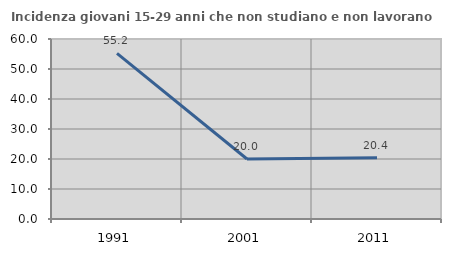
| Category | Incidenza giovani 15-29 anni che non studiano e non lavorano  |
|---|---|
| 1991.0 | 55.215 |
| 2001.0 | 20 |
| 2011.0 | 20.408 |